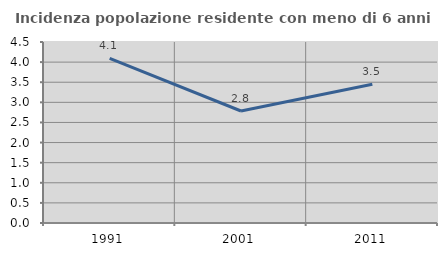
| Category | Incidenza popolazione residente con meno di 6 anni |
|---|---|
| 1991.0 | 4.094 |
| 2001.0 | 2.784 |
| 2011.0 | 3.451 |